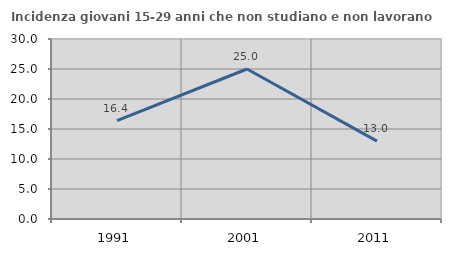
| Category | Incidenza giovani 15-29 anni che non studiano e non lavorano  |
|---|---|
| 1991.0 | 16.399 |
| 2001.0 | 25 |
| 2011.0 | 12.987 |